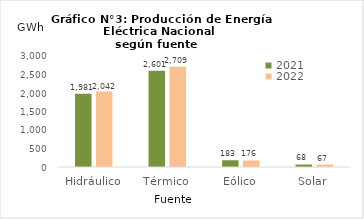
| Category | 2021 | 2022 |
|---|---|---|
| Hidráulico | 1980.994 | 2042.113 |
| Térmico | 2600.579 | 2709.263 |
| Eólico | 182.679 | 175.873 |
| Solar | 67.586 | 67.429 |